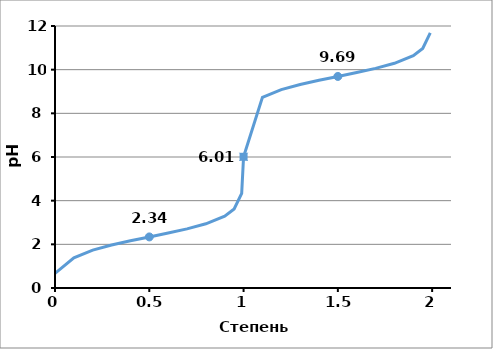
| Category | pH |
|---|---|
| 0.0 | 0.67 |
| 0.1 | 1.386 |
| 0.2 | 1.738 |
| 0.3 | 1.972 |
| 0.4 | 2.164 |
| 0.5 | 2.34 |
| 0.6 | 2.516 |
| 0.7 | 2.708 |
| 0.8 | 2.942 |
| 0.9 | 3.294 |
| 0.95 | 3.619 |
| 0.99 | 4.336 |
| 1.0 | 6.01 |
| 1.1 | 8.736 |
| 1.2 | 9.088 |
| 1.3 | 9.322 |
| 1.4 | 9.514 |
| 1.5 | 9.69 |
| 1.6 | 9.866 |
| 1.7 | 10.058 |
| 1.8 | 10.292 |
| 1.9 | 10.644 |
| 1.95 | 10.969 |
| 1.99 | 11.686 |